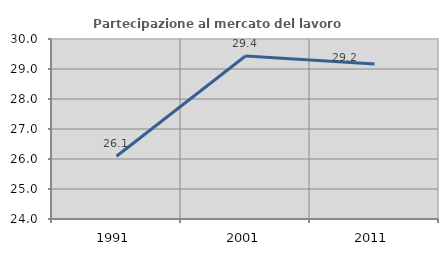
| Category | Partecipazione al mercato del lavoro  femminile |
|---|---|
| 1991.0 | 26.094 |
| 2001.0 | 29.433 |
| 2011.0 | 29.167 |